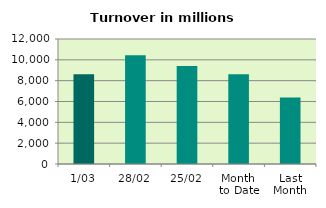
| Category | Series 0 |
|---|---|
| 1/03 | 8605.609 |
| 28/02 | 10443.728 |
| 25/02 | 9415.06 |
| Month 
to Date | 8605.609 |
| Last
Month | 6378.947 |